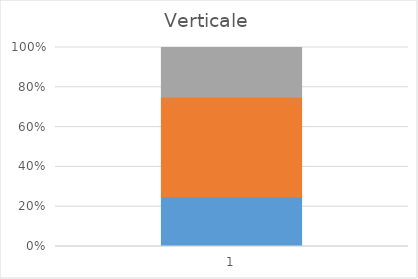
| Category | A | B | C |
|---|---|---|---|
| 0 | 20 | 40 | 20 |